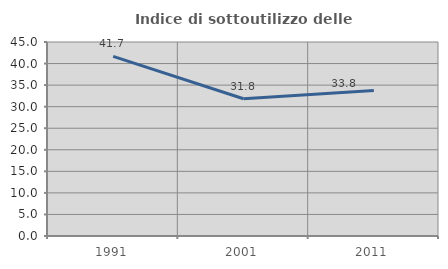
| Category | Indice di sottoutilizzo delle abitazioni  |
|---|---|
| 1991.0 | 41.667 |
| 2001.0 | 31.833 |
| 2011.0 | 33.762 |